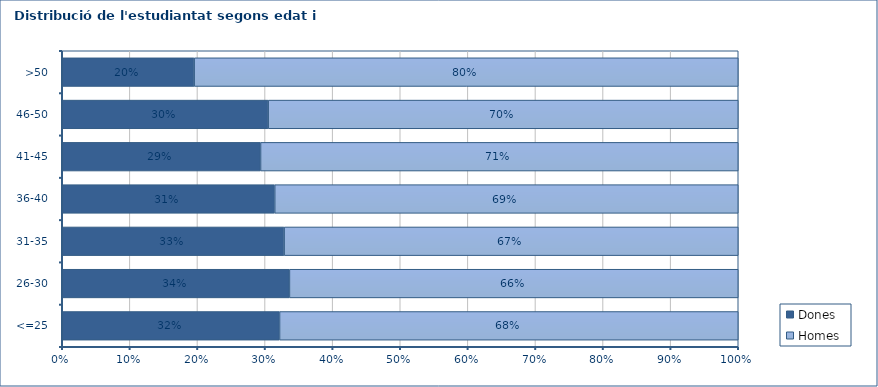
| Category | Dones | Homes |
|---|---|---|
| <=25 | 0.321 | 0.679 |
| 26-30 | 0.336 | 0.664 |
| 31-35 | 0.328 | 0.672 |
| 36-40 | 0.314 | 0.686 |
| 41-45 | 0.293 | 0.707 |
| 46-50 | 0.305 | 0.695 |
| >50 | 0.195 | 0.805 |